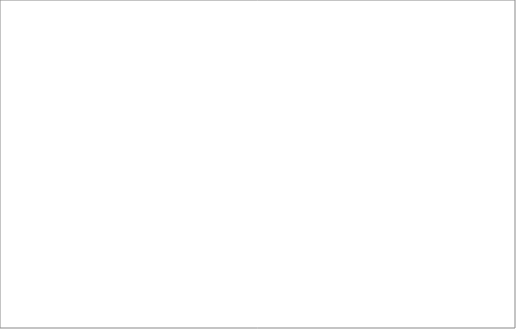
| Category | Total |
|---|---|
| NHSE | 99 |
| ICB | 58 |